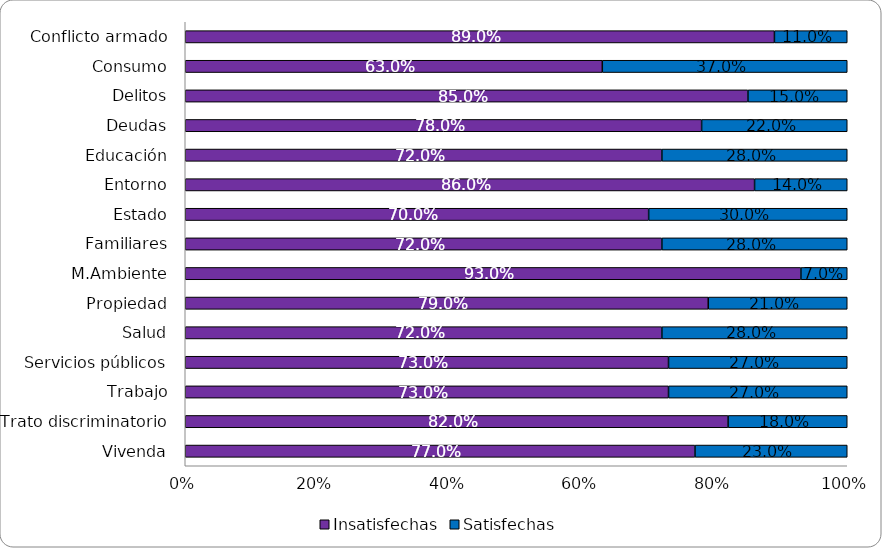
| Category | Insatisfechas | Satisfechas |
|---|---|---|
| Conflicto armado | 0.89 | 0.11 |
| Consumo | 0.63 | 0.37 |
| Delitos | 0.85 | 0.15 |
| Deudas | 0.78 | 0.22 |
| Educación | 0.72 | 0.28 |
| Entorno | 0.86 | 0.14 |
| Estado | 0.7 | 0.3 |
| Familiares | 0.72 | 0.28 |
| M.Ambiente | 0.93 | 0.07 |
| Propiedad | 0.79 | 0.21 |
| Salud | 0.72 | 0.28 |
| Servicios públicos | 0.73 | 0.27 |
| Trabajo | 0.73 | 0.27 |
| Trato discriminatorio | 0.82 | 0.18 |
| Vivenda | 0.77 | 0.23 |